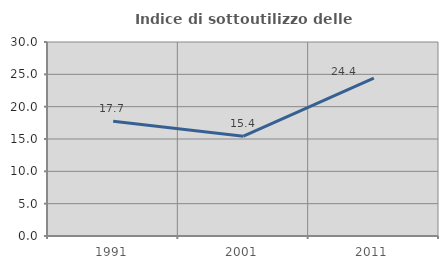
| Category | Indice di sottoutilizzo delle abitazioni  |
|---|---|
| 1991.0 | 17.743 |
| 2001.0 | 15.441 |
| 2011.0 | 24.411 |